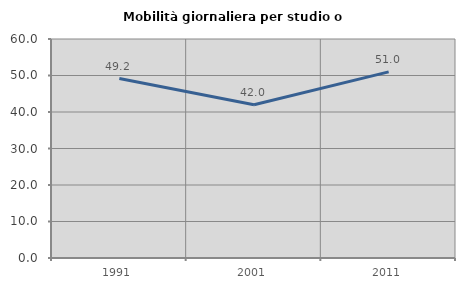
| Category | Mobilità giornaliera per studio o lavoro |
|---|---|
| 1991.0 | 49.173 |
| 2001.0 | 41.979 |
| 2011.0 | 51 |